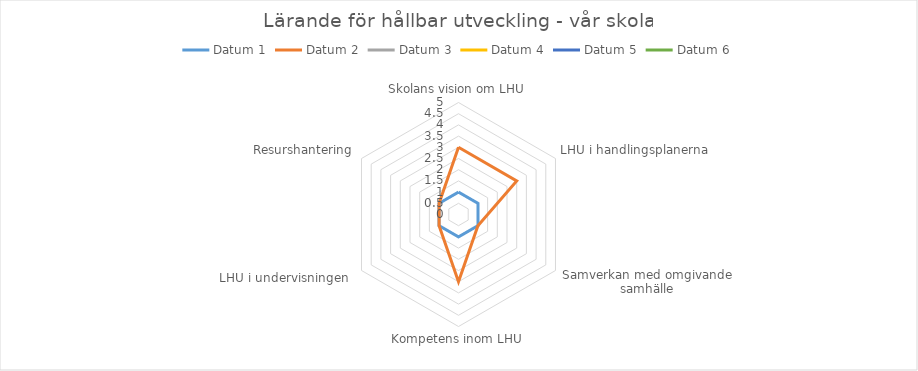
| Category | Datum 1 | Datum 2 | Datum 3 | Datum 4 | Datum 5 | Datum 6 |
|---|---|---|---|---|---|---|
| Skolans vision om LHU | 1 | 3 |  |  |  |  |
| LHU i handlingsplanerna | 1 | 3 |  |  |  |  |
| Samverkan med omgivande samhälle | 1 | 1 |  |  |  |  |
| Kompetens inom LHU | 1 | 3 |  |  |  |  |
| LHU i undervisningen  | 1 | 1 |  |  |  |  |
| Resurshantering | 1 | 1 |  |  |  |  |